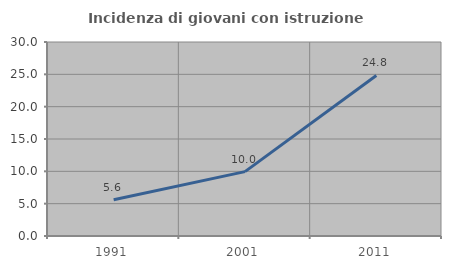
| Category | Incidenza di giovani con istruzione universitaria |
|---|---|
| 1991.0 | 5.598 |
| 2001.0 | 9.958 |
| 2011.0 | 24.832 |